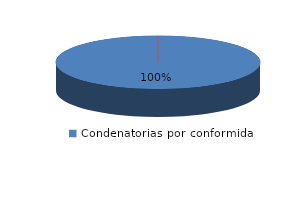
| Category | Series 0 |
|---|---|
| 0 | 16 |
| 1 | 0 |